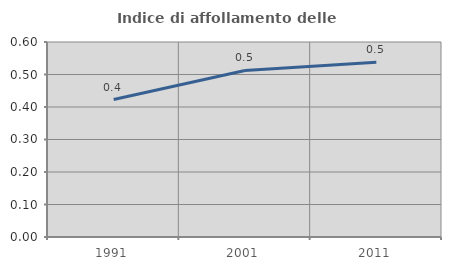
| Category | Indice di affollamento delle abitazioni  |
|---|---|
| 1991.0 | 0.423 |
| 2001.0 | 0.512 |
| 2011.0 | 0.538 |